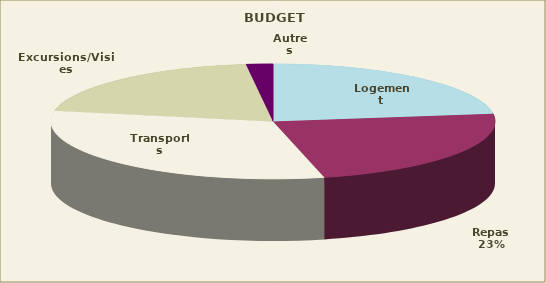
| Category | Series 0 |
|---|---|
| Logement | 50.277 |
| Repas | 51.621 |
| Transports | 69.73 |
| Excursions/Visites | 44.156 |
| Autres | 4.281 |